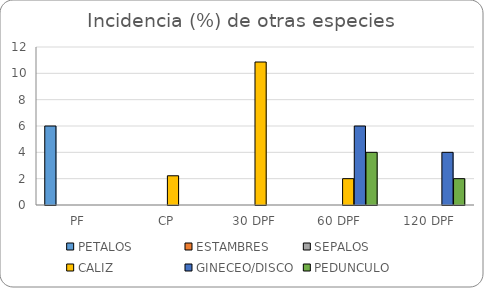
| Category | PETALOS  | ESTAMBRES | SEPALOS | CALIZ  | GINECEO/DISCO | PEDUNCULO |
|---|---|---|---|---|---|---|
| PF | 6 | 0 | 0 | 0 | 0 | 0 |
| CP | 0 | 0 | 0 | 2.22 | 0 | 0 |
| 30 DPF | 0 | 0 | 0 | 10.86 | 0 | 0 |
| 60 DPF  | 0 | 0 | 0 | 2 | 6 | 4 |
| 120 DPF | 0 | 0 | 0 | 0 | 4 | 2 |